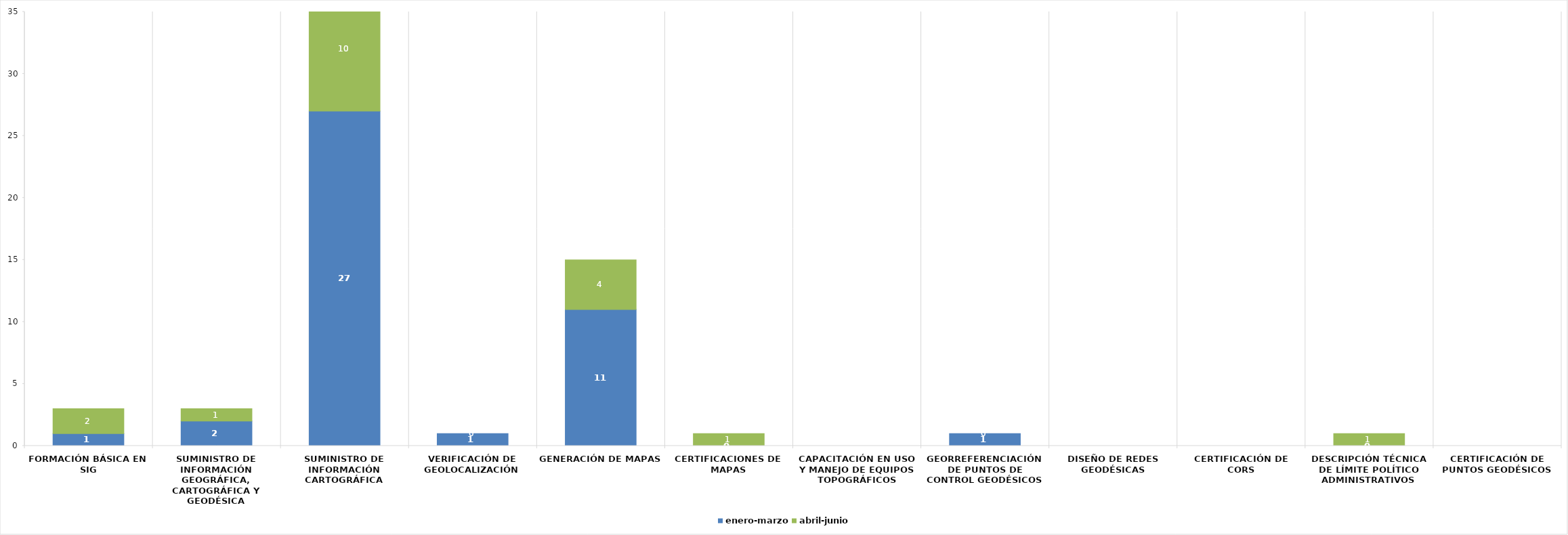
| Category | enero-marzo | abril-junio |
|---|---|---|
| Formación básica en SIG | 1 | 2 |
| Suministro de información geográfica, cartográfica y geodésica | 2 | 1 |
| Suministro de información cartográfica | 27 | 10 |
| Verificación de geolocalización | 1 | 0 |
| Generación de mapas | 11 | 4 |
| Certificaciones de mapas | 0 | 1 |
| Capacitación en uso y manejo de equipos topográficos | 0 | 0 |
| Georreferenciación de puntos de control geodésicos | 1 | 0 |
| Diseño de Redes Geodésicas | 0 | 0 |
| Certificación de CORS | 0 | 0 |
| Descripción técnica de límite político administrativos | 0 | 1 |
| Certificación de puntos geodésicos | 0 | 0 |